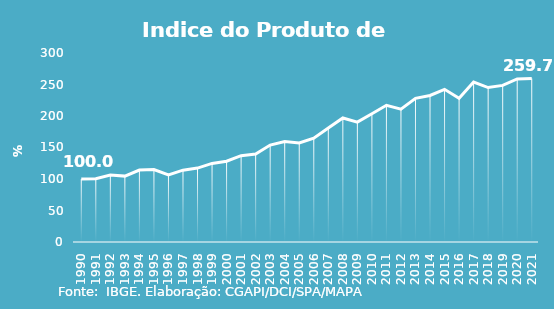
| Category | Indice de Prod. base 1990 |
|---|---|
| 1990.0 | 100 |
| 1991.0 | 100.275 |
| 1992.0 | 106.203 |
| 1993.0 | 104.57 |
| 1994.0 | 114.164 |
| 1995.0 | 115.024 |
| 1996.0 | 106.552 |
| 1997.0 | 114.037 |
| 1998.0 | 117.319 |
| 1999.0 | 124.734 |
| 2000.0 | 128.293 |
| 2001.0 | 136.975 |
| 2002.0 | 139.51 |
| 2003.0 | 153.868 |
| 2004.0 | 159.641 |
| 2005.0 | 157.136 |
| 2006.0 | 164.858 |
| 2007.0 | 180.781 |
| 2008.0 | 196.91 |
| 2009.0 | 190.309 |
| 2010.0 | 203.581 |
| 2011.0 | 217.041 |
| 2012.0 | 210.932 |
| 2013.0 | 228.009 |
| 2014.0 | 232.562 |
| 2015.0 | 242.318 |
| 2016.0 | 228.239 |
| 2017.0 | 253.826 |
| 2018.0 | 245.134 |
| 2019.0 | 248.619 |
| 2020.0 | 258.848 |
| 2021.0 | 259.656 |